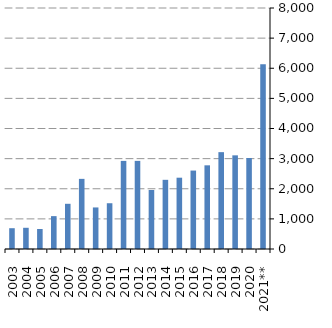
| Category | Series 0 |
|---|---|
| 2003 | 690339.182 |
| 2004 | 704132.312 |
| 2005 | 663559.198 |
| 2006 | 1091165.181 |
| 2007 | 1500649.721 |
| 2008 | 2328183.221 |
| 2009 | 1379261.704 |
| 2010 | 1519247.391 |
| 2011 | 2924598.634 |
| 2012 | 2925343.651 |
| 2013 | 1959259.119 |
| 2014 | 2296236.466 |
| 2015 | 2366800.451 |
| 2016 | 2603820.384 |
| 2017 | 2777745.401 |
| 2018 | 3215038.239 |
| 2019 | 3109120.978 |
| 2020 | 3021114.08 |
| 2021** | 6132138.99 |